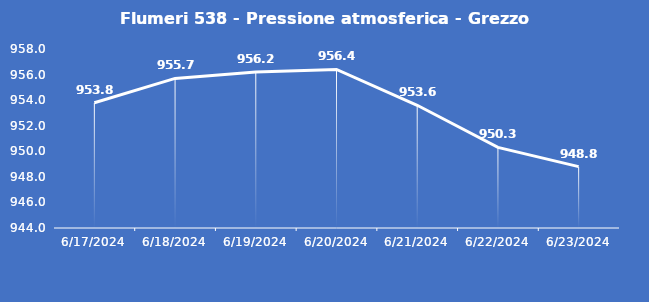
| Category | Flumeri 538 - Pressione atmosferica - Grezzo (hPa) |
|---|---|
| 6/17/24 | 953.8 |
| 6/18/24 | 955.7 |
| 6/19/24 | 956.2 |
| 6/20/24 | 956.4 |
| 6/21/24 | 953.6 |
| 6/22/24 | 950.3 |
| 6/23/24 | 948.8 |